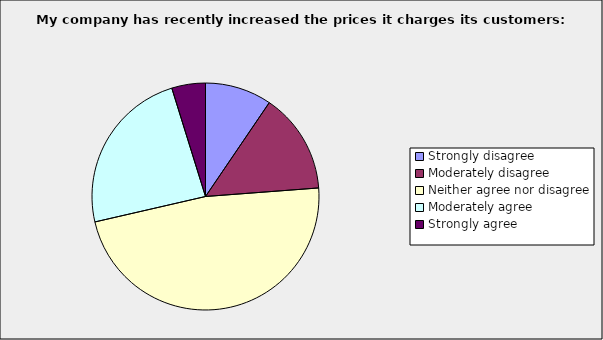
| Category | Series 0 |
|---|---|
| Strongly disagree | 0.095 |
| Moderately disagree | 0.143 |
| Neither agree nor disagree | 0.476 |
| Moderately agree | 0.238 |
| Strongly agree | 0.048 |